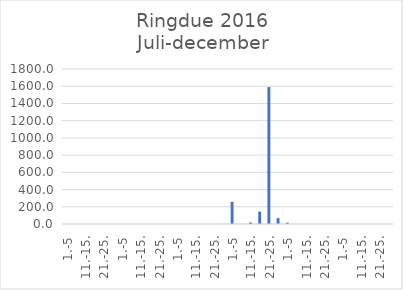
| Category | Series 0 |
|---|---|
| 1.-5 | 0 |
| 6.-10. | 0 |
| 11.-15. | 0 |
| 16.-20. | 0 |
| 21.-25. | 0 |
| 26.-31. | 0 |
| 1.-5 | 0 |
| 6.-10. | 0 |
| 11.-15. | 0 |
| 16.-20. | 0 |
| 21.-25. | 0 |
| 26.-31. | 0 |
| 1.-5 | 0 |
| 6.-10. | 0 |
| 11.-15. | 0 |
| 16.-20. | 0 |
| 21.-25. | 0 |
| 26.-30. | 0 |
| 1.-5 | 257.861 |
| 6.-10. | 0.843 |
| 11.-15. | 17.646 |
| 16.-20. | 144.054 |
| 21.-25. | 1590.169 |
| 26.-31. | 68.701 |
| 1.-5 | 15.314 |
| 6.-10. | 0 |
| 11.-15. | 0 |
| 16.-20. | 0 |
| 21.-25. | 0 |
| 26.-30. | 0 |
| 1.-5 | 0 |
| 6.-10. | 0 |
| 11.-15. | 0 |
| 16.-20. | 0 |
| 21.-25. | 0 |
| 26.-31. | 0 |